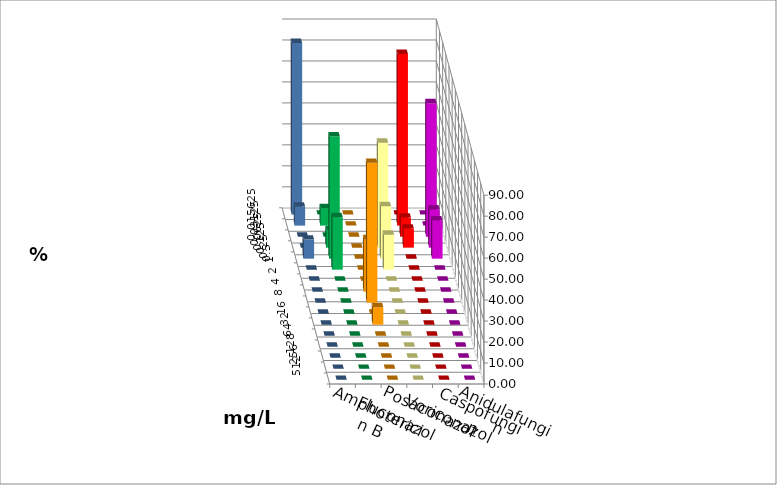
| Category | Amphotericin B | Fluconazol | Posaconazol | Voriconazol | Caspofungin | Anidulafungin |
|---|---|---|---|---|---|---|
| 0.015625 | 0 | 0 | 0 | 0 | 0 | 81.818 |
| 0.03125 | 8.333 | 0 | 8.333 | 81.818 | 0 | 9.091 |
| 0.0625 | 0 | 0 | 0 | 9.091 | 63.636 | 0 |
| 0.125 | 8.333 | 0 | 50 | 9.091 | 18.182 | 0 |
| 0.25 | 58.333 | 0 | 25 | 0 | 18.182 | 9.091 |
| 0.5 | 25 | 0 | 16.667 | 0 | 0 | 0 |
| 1.0 | 0 | 0 | 0 | 0 | 0 | 0 |
| 2.0 | 0 | 25 | 0 | 0 | 0 | 0 |
| 4.0 | 0 | 66.667 | 0 | 0 | 0 | 0 |
| 8.0 | 0 | 0 | 0 | 0 | 0 | 0 |
| 16.0 | 0 | 8.333 | 0 | 0 | 0 | 0 |
| 32.0 | 0 | 0 | 0 | 0 | 0 | 0 |
| 64.0 | 0 | 0 | 0 | 0 | 0 | 0 |
| 128.0 | 0 | 0 | 0 | 0 | 0 | 0 |
| 256.0 | 0 | 0 | 0 | 0 | 0 | 0 |
| 512.0 | 0 | 0 | 0 | 0 | 0 | 0 |